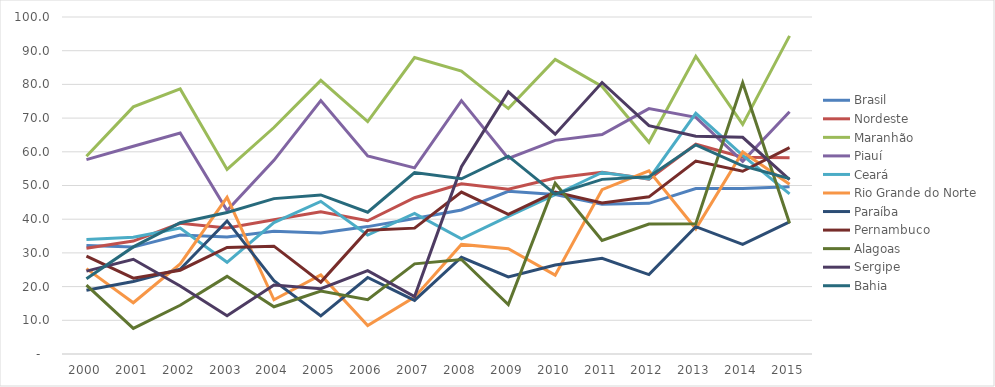
| Category | Brasil | Nordeste | Maranhão | Piauí | Ceará | Rio Grande do Norte | Paraíba | Pernambuco | Alagoas | Sergipe | Bahia |
|---|---|---|---|---|---|---|---|---|---|---|---|
| 2000.0 | 32.167 | 31.399 | 58.667 | 57.673 | 33.999 | 25.345 | 18.908 | 29.027 | 20.449 | 24.598 | 22.328 |
| 2001.0 | 31.726 | 33.518 | 73.336 | 61.648 | 34.628 | 15.209 | 21.493 | 22.49 | 7.617 | 28.121 | 31.78 |
| 2002.0 | 35.287 | 38.778 | 78.67 | 65.571 | 37.37 | 26.721 | 25.161 | 24.868 | 14.449 | 20.165 | 38.947 |
| 2003.0 | 34.73 | 37.411 | 54.767 | 42.604 | 27.202 | 46.493 | 39.489 | 31.618 | 23.039 | 11.354 | 41.999 |
| 2004.0 | 36.41 | 39.828 | 67.21 | 57.471 | 38.981 | 16.097 | 21.778 | 32.004 | 14.009 | 20.449 | 46.107 |
| 2005.0 | 35.874 | 42.239 | 81.21 | 75.179 | 45.284 | 23.485 | 11.323 | 21.331 | 18.695 | 19.381 | 47.196 |
| 2006.0 | 37.802 | 39.54 | 68.982 | 58.785 | 35.309 | 8.455 | 22.695 | 36.742 | 16.092 | 24.733 | 42.067 |
| 2007.0 | 40.218 | 46.375 | 87.97 | 55.237 | 41.716 | 16.868 | 15.926 | 37.351 | 26.755 | 17.069 | 53.856 |
| 2008.0 | 42.735 | 50.496 | 83.976 | 75.175 | 34.175 | 32.514 | 28.71 | 48.054 | 28.044 | 55.565 | 51.997 |
| 2009.0 | 48.269 | 48.923 | 72.825 | 58.021 | 40.857 | 31.226 | 22.873 | 41.461 | 14.649 | 77.792 | 58.693 |
| 2010.0 | 47.296 | 52.238 | 87.397 | 63.392 | 47.252 | 23.395 | 26.424 | 48.06 | 50.669 | 65.224 | 47.431 |
| 2011.0 | 44.467 | 53.964 | 79.393 | 65.123 | 53.857 | 48.745 | 28.391 | 44.82 | 33.693 | 80.559 | 51.819 |
| 2012.0 | 44.71 | 51.912 | 62.812 | 72.818 | 51.933 | 54.355 | 23.578 | 46.633 | 38.571 | 67.775 | 52.566 |
| 2013.0 | 49.115 | 62.245 | 88.313 | 70.211 | 71.418 | 37.156 | 37.792 | 57.26 | 38.675 | 64.599 | 62.064 |
| 2014.0 | 49.124 | 58.401 | 68.146 | 57.185 | 58.91 | 59.962 | 32.54 | 54.233 | 80.468 | 64.294 | 55.851 |
| 2015.0 | 49.636 | 58.241 | 94.399 | 71.88 | 47.492 | 50.396 | 39.218 | 61.265 | 38.821 | 51.73 | 52.051 |